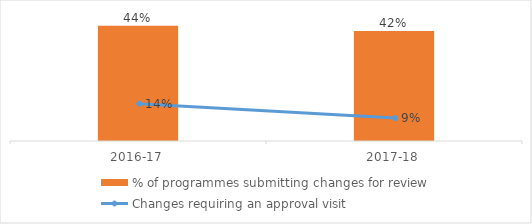
| Category | % of programmes submitting changes for review |
|---|---|
| 2016-17 | 0.44 |
| 2017-18 | 0.42 |